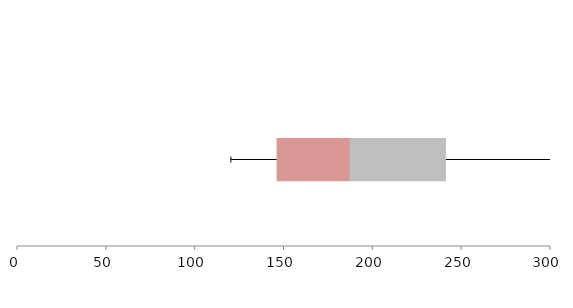
| Category | Series 1 | Series 2 | Series 3 |
|---|---|---|---|
| 0 | 146.103 | 41.298 | 54.059 |